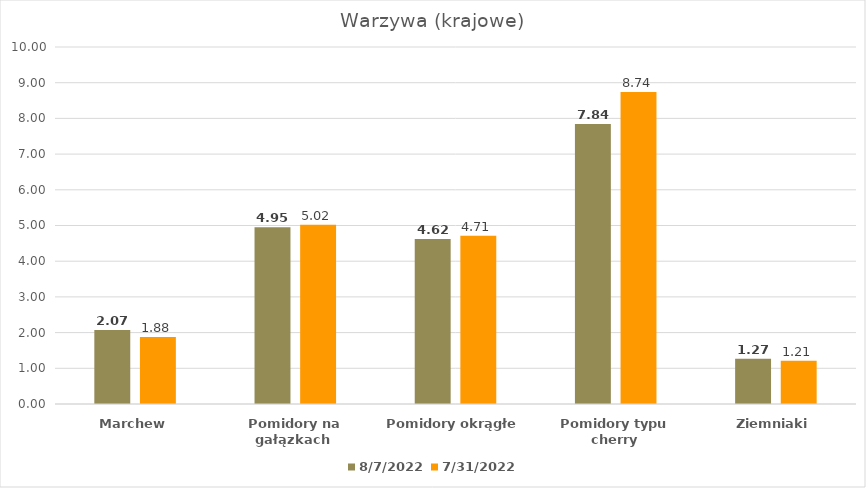
| Category | 2022-08-07 | 2022-07-31 |
|---|---|---|
| Marchew | 2.07 | 1.88 |
| Pomidory na gałązkach  | 4.95 | 5.02 |
| Pomidory okrągłe | 4.62 | 4.71 |
| Pomidory typu cherry | 7.84 | 8.74 |
| Ziemniaki | 1.27 | 1.21 |